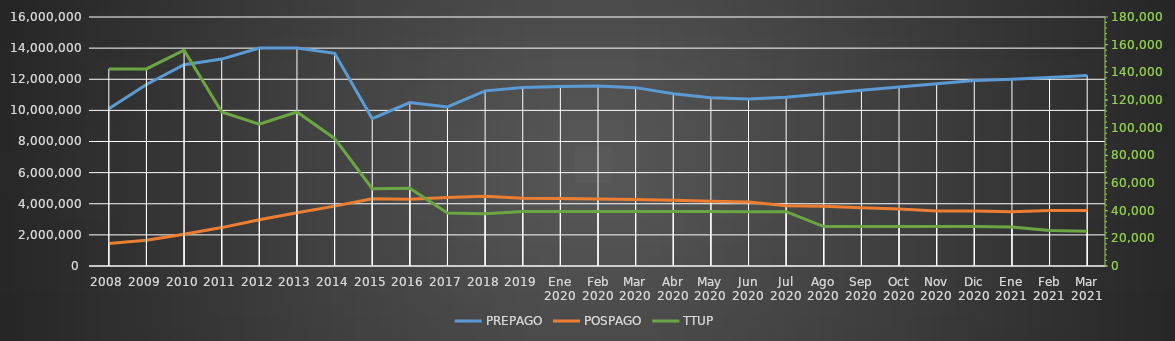
| Category | PREPAGO | POSPAGO |
|---|---|---|
| 2008 | 10097768 | 1452088 |
| 2009 | 11662294 | 1649838 |
| 2010 | 12929040 | 2033814 |
| 2011 | 13295834 | 2467378 |
| 2012 | 14008104 | 2976194 |
| 2013 | 14005126 | 3425277 |
| 2014 | 13666071 | 3846271 |
| 2015 | 9476240 | 4326937 |
| 2016 | 10498467 | 4293426 |
| 2017 | 10219457 | 4393703 |
| 2018 | 11254168 | 4480975 |
| 2019 | 11462048 | 4351686 |
| Ene 2020 | 11533220 | 4334391 |
| Feb 2020 | 11570642 | 4308478 |
| Mar 2020 | 11461517 | 4278370 |
| Abr 2020 | 11073657 | 4217911 |
| May 2020 | 10806656 | 4155948 |
| Jun 2020 | 10725910 | 4112569 |
| Jul 2020 | 10842756 | 3875020 |
| Ago 2020 | 11074748 | 3842518 |
| Sep 2020 | 11294219 | 3748130 |
| Oct 2020 | 11499640 | 3664524 |
| Nov 2020 | 11708585 | 3532266 |
| Dic 2020 | 11917697 | 3539192 |
| Ene 2021 | 12003949 | 3488989 |
| Feb 2021 | 12106447 | 3569500 |
| Mar 2021 | 12246288 | 3569146 |